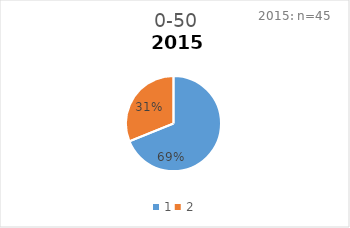
| Category | 0-50 |
|---|---|
| 0 | 0.689 |
| 1 | 0.311 |